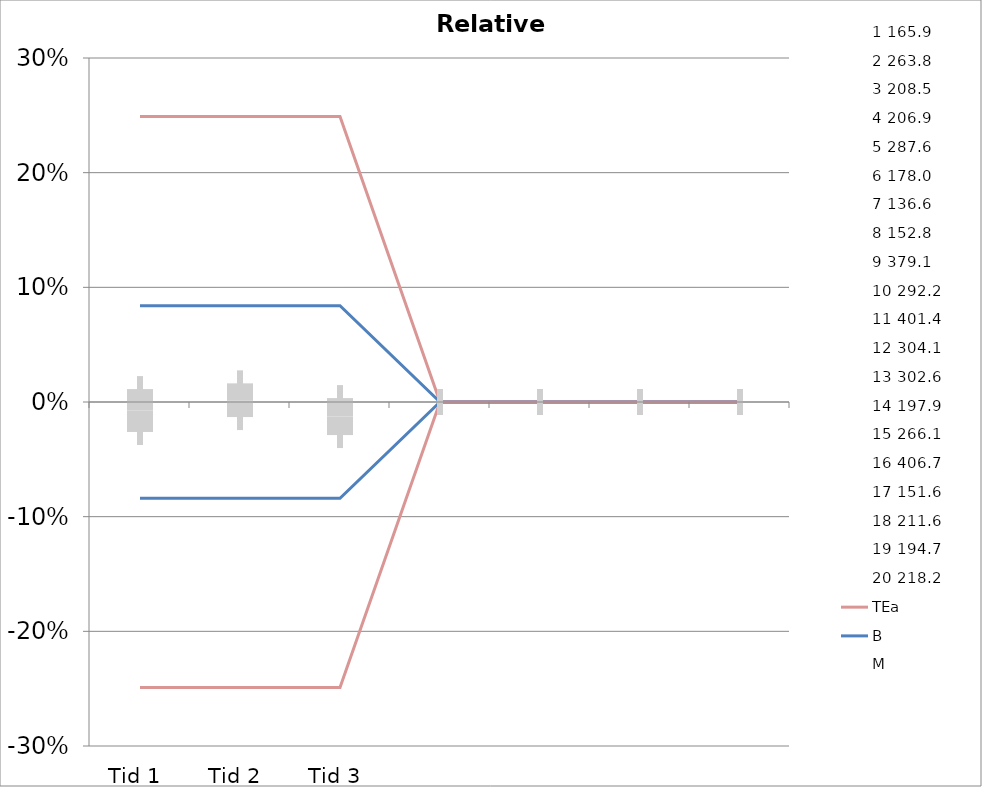
| Category | 1 | 2 | 3 | 4 | 5 | 6 | 7 | 8 | 9 | 10 | 11 | 12 | 13 | 14 | 15 | 16 | 17 | 18 | 19 | 20 | TEa | B | -B | -TEa | M |
|---|---|---|---|---|---|---|---|---|---|---|---|---|---|---|---|---|---|---|---|---|---|---|---|---|---|
| Tid 1 | -0.022 | 0.074 | 0.01 | -0.002 | 0.011 | -0.037 | 0.01 | -0.033 | -0.026 | -0.034 | 0.006 | 0.026 | 0.04 | -0.069 | -0.059 | 0.024 | 0.005 | 0 | -0.058 | 0 | 0.249 | 0.084 | -0.084 | -0.249 | -0.007 |
| Tid 2 | 0.001 | 0.012 | 0.041 | 0.005 | 0.015 | 0.006 | 0.054 | 0.008 | -0.006 | -0.031 | 0.018 | -0.006 | 0.051 | -0.045 | -0.059 | 0.03 | 0.015 | -0.048 | -0.001 | -0.029 | 0.249 | 0.084 | -0.084 | -0.249 | 0.002 |
| Tid 3 | 0.013 | 0.031 | -0.017 | -0.024 | -0.006 | -0.034 | -0.041 | 0.047 | -0.019 | 0 | 0 | 0 | 0 | 0 | 0 | -0.034 | 0.004 | -0.021 | -0.052 | -0.026 | 0.249 | 0.084 | -0.084 | -0.249 | -0.013 |